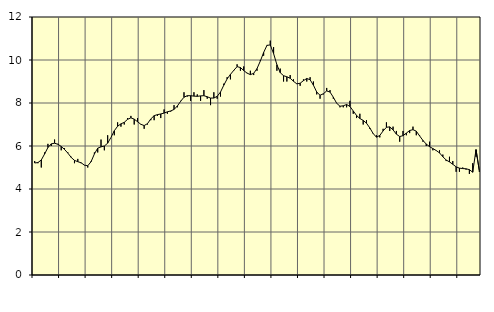
| Category | Piggar | Series 1 |
|---|---|---|
| nan | 5.3 | 5.21 |
| 87.0 | 5.2 | 5.23 |
| 87.0 | 5 | 5.35 |
| 87.0 | 5.7 | 5.63 |
| nan | 6.1 | 5.93 |
| 88.0 | 6 | 6.1 |
| 88.0 | 6.3 | 6.13 |
| 88.0 | 6.1 | 6.08 |
| nan | 5.8 | 5.98 |
| 89.0 | 5.9 | 5.84 |
| 89.0 | 5.7 | 5.67 |
| 89.0 | 5.5 | 5.47 |
| nan | 5.2 | 5.33 |
| 90.0 | 5.4 | 5.27 |
| 90.0 | 5.2 | 5.22 |
| 90.0 | 5.1 | 5.11 |
| nan | 5 | 5.08 |
| 91.0 | 5.3 | 5.27 |
| 91.0 | 5.7 | 5.63 |
| 91.0 | 5.7 | 5.9 |
| nan | 6.3 | 5.96 |
| 92.0 | 5.8 | 6 |
| 92.0 | 6.5 | 6.13 |
| 92.0 | 6.4 | 6.4 |
| nan | 6.5 | 6.71 |
| 93.0 | 7.1 | 6.92 |
| 93.0 | 6.9 | 7.03 |
| 93.0 | 7 | 7.1 |
| nan | 7.3 | 7.24 |
| 94.0 | 7.4 | 7.31 |
| 94.0 | 7 | 7.25 |
| 94.0 | 7.3 | 7.13 |
| nan | 7 | 7.01 |
| 95.0 | 6.8 | 6.95 |
| 95.0 | 7 | 7.04 |
| 95.0 | 7.2 | 7.26 |
| nan | 7.2 | 7.41 |
| 96.0 | 7.4 | 7.46 |
| 96.0 | 7.3 | 7.49 |
| 96.0 | 7.7 | 7.53 |
| nan | 7.5 | 7.59 |
| 97.0 | 7.6 | 7.63 |
| 97.0 | 7.9 | 7.7 |
| 97.0 | 7.8 | 7.86 |
| nan | 8.1 | 8.08 |
| 98.0 | 8.5 | 8.27 |
| 98.0 | 8.3 | 8.34 |
| 98.0 | 8.1 | 8.34 |
| nan | 8.5 | 8.32 |
| 99.0 | 8.4 | 8.31 |
| 99.0 | 8.1 | 8.33 |
| 99.0 | 8.6 | 8.34 |
| nan | 8.2 | 8.29 |
| 0.0 | 7.9 | 8.23 |
| 0.0 | 8.5 | 8.23 |
| 0.0 | 8.2 | 8.31 |
| nan | 8.3 | 8.51 |
| 1.0 | 8.9 | 8.83 |
| 1.0 | 9.2 | 9.12 |
| 1.0 | 9.1 | 9.33 |
| nan | 9.5 | 9.52 |
| 2.0 | 9.8 | 9.69 |
| 2.0 | 9.5 | 9.65 |
| 2.0 | 9.7 | 9.51 |
| nan | 9.4 | 9.39 |
| 3.0 | 9.5 | 9.32 |
| 3.0 | 9.3 | 9.38 |
| 3.0 | 9.5 | 9.6 |
| nan | 10 | 9.95 |
| 4.0 | 10.2 | 10.35 |
| 4.0 | 10.7 | 10.68 |
| 4.0 | 10.9 | 10.7 |
| nan | 10.6 | 10.3 |
| 5.0 | 9.5 | 9.78 |
| 5.0 | 9.6 | 9.41 |
| 5.0 | 9 | 9.27 |
| nan | 9 | 9.22 |
| 6.0 | 9.3 | 9.15 |
| 6.0 | 9.1 | 9.01 |
| 6.0 | 8.9 | 8.89 |
| nan | 8.8 | 8.92 |
| 7.0 | 9.1 | 9.04 |
| 7.0 | 9 | 9.14 |
| 7.0 | 9.2 | 9.08 |
| nan | 9 | 8.83 |
| 8.0 | 8.4 | 8.51 |
| 8.0 | 8.2 | 8.36 |
| 8.0 | 8.4 | 8.43 |
| nan | 8.7 | 8.56 |
| 9.0 | 8.6 | 8.51 |
| 9.0 | 8.2 | 8.27 |
| 9.0 | 8 | 7.99 |
| nan | 7.8 | 7.85 |
| 10.0 | 7.8 | 7.87 |
| 10.0 | 7.8 | 7.93 |
| 10.0 | 8.1 | 7.84 |
| nan | 7.5 | 7.63 |
| 11.0 | 7.3 | 7.42 |
| 11.0 | 7.5 | 7.28 |
| 11.0 | 7 | 7.19 |
| nan | 7.2 | 7.06 |
| 12.0 | 6.8 | 6.84 |
| 12.0 | 6.6 | 6.58 |
| 12.0 | 6.5 | 6.41 |
| nan | 6.4 | 6.49 |
| 13.0 | 6.8 | 6.7 |
| 13.0 | 7.1 | 6.87 |
| 13.0 | 6.7 | 6.89 |
| nan | 6.9 | 6.75 |
| 14.0 | 6.7 | 6.55 |
| 14.0 | 6.2 | 6.44 |
| 14.0 | 6.7 | 6.48 |
| nan | 6.5 | 6.6 |
| 15.0 | 6.6 | 6.72 |
| 15.0 | 6.9 | 6.76 |
| 15.0 | 6.5 | 6.69 |
| nan | 6.5 | 6.47 |
| 16.0 | 6.2 | 6.26 |
| 16.0 | 6 | 6.09 |
| 16.0 | 6.2 | 5.97 |
| nan | 5.8 | 5.88 |
| 17.0 | 5.8 | 5.79 |
| 17.0 | 5.8 | 5.68 |
| 17.0 | 5.6 | 5.5 |
| nan | 5.3 | 5.35 |
| 18.0 | 5.5 | 5.26 |
| 18.0 | 5.3 | 5.15 |
| 18.0 | 4.8 | 5.03 |
| nan | 4.8 | 4.97 |
| 19.0 | 5 | 4.95 |
| 19.0 | 4.9 | 4.94 |
| 19.0 | 4.7 | 4.9 |
| nan | 5.2 | 4.78 |
| 20.0 | 5.5 | 5.83 |
| 20.0 | 4.8 | 4.85 |